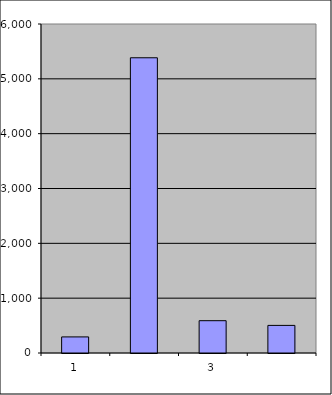
| Category | Series 0 |
|---|---|
| 0 | 293.5 |
| 1 | 5384.119 |
| 2 | 589.096 |
| 3 | 503.411 |